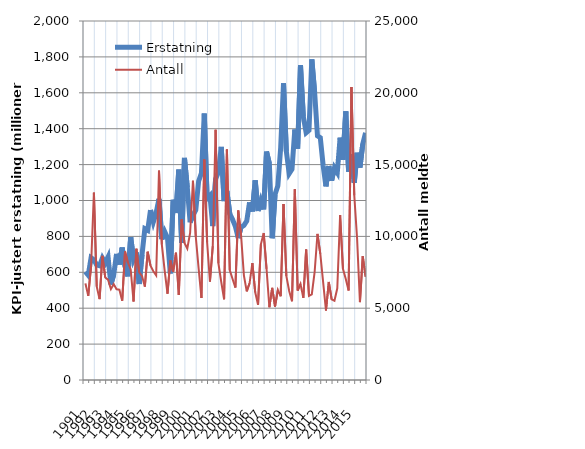
| Category | Erstatning |
|---|---|
| 1991.0 | 603.481 |
| nan | 583.801 |
| nan | 681.18 |
| nan | 669.603 |
| 1992.0 | 640.692 |
| nan | 636.6 |
| nan | 679.715 |
| nan | 652.46 |
| 1993.0 | 685.11 |
| nan | 532.071 |
| nan | 587.038 |
| nan | 702.553 |
| 1994.0 | 643.28 |
| nan | 737.946 |
| nan | 632.475 |
| nan | 577.464 |
| 1995.0 | 795.896 |
| nan | 672.716 |
| nan | 709.814 |
| nan | 535.299 |
| 1996.0 | 697.434 |
| nan | 842.561 |
| nan | 834.158 |
| nan | 946.501 |
| 1997.0 | 880.353 |
| nan | 930.976 |
| nan | 1009.305 |
| nan | 784.671 |
| 1998.0 | 826.639 |
| nan | 792.153 |
| nan | 593.691 |
| nan | 1004.115 |
| 1999.0 | 930.353 |
| nan | 1171.553 |
| nan | 763.248 |
| nan | 1237.391 |
| 2000.0 | 1073.081 |
| nan | 878.192 |
| nan | 918.127 |
| nan | 947.533 |
| 2001.0 | 1107.577 |
| nan | 1152.908 |
| nan | 1484.498 |
| nan | 1011.7 |
| 2002.0 | 1027.564 |
| nan | 857.616 |
| nan | 1119.058 |
| nan | 1157.483 |
| 2003.0 | 1298.758 |
| nan | 996.944 |
| nan | 1052.381 |
| nan | 926.811 |
| 2004.0 | 893.862 |
| nan | 855.082 |
| nan | 790.749 |
| nan | 851.902 |
| 2005.0 | 861.134 |
| nan | 885.928 |
| nan | 989.7 |
| nan | 939.181 |
| 2006.0 | 1112.107 |
| nan | 941.928 |
| nan | 998.915 |
| nan | 950.247 |
| 2007.0 | 1272.529 |
| nan | 1205.484 |
| nan | 789.79 |
| nan | 1033.21 |
| 2008.0 | 1082.173 |
| nan | 1294.715 |
| nan | 1653.143 |
| nan | 1273.488 |
| 2009.0 | 1149.85 |
| nan | 1173.942 |
| nan | 1395.31 |
| nan | 1289.196 |
| 2010.0 | 1753.533 |
| nan | 1467.453 |
| nan | 1377.784 |
| nan | 1391.074 |
| 2011.0 | 1786.114 |
| nan | 1602.462 |
| nan | 1359.902 |
| nan | 1349.973 |
| 2012.0 | 1195.733 |
| nan | 1078.773 |
| nan | 1192.147 |
| nan | 1110.769 |
| 2013.0 | 1181.853 |
| nan | 1155.655 |
| nan | 1350.015 |
| nan | 1227.003 |
| 2014.0 | 1496.943 |
| nan | 1160.463 |
| nan | 1258.954 |
| nan | 1098.824 |
| 2015.0 | 1265.965 |
| nan | 1183.401 |
| nan | 1314.225 |
| nan | 1377.055 |